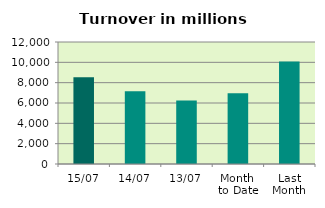
| Category | Series 0 |
|---|---|
| 15/07 | 8523.067 |
| 14/07 | 7148.786 |
| 13/07 | 6244.976 |
| Month 
to Date | 6964.416 |
| Last
Month | 10085.686 |